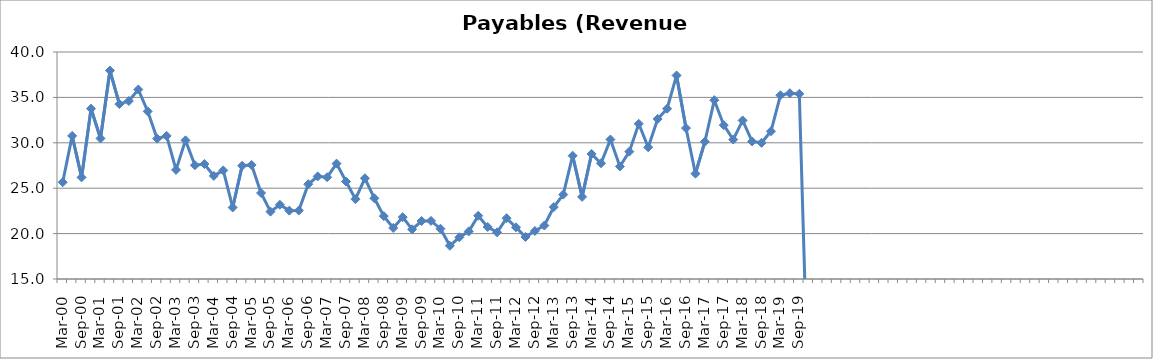
| Category | Payables (Revenue Days) |
|---|---|
| Mar-00 | 25.656 |
| Jun-00 | 30.761 |
| Sep-00 | 26.193 |
| Dec-00 | 33.759 |
| Mar-01 | 30.477 |
| Jun-01 | 37.958 |
| Sep-01 | 34.261 |
| Dec-01 | 34.604 |
| Mar-02 | 35.871 |
| Jun-02 | 33.462 |
| Sep-02 | 30.46 |
| Dec-02 | 30.76 |
| Mar-03 | 27.023 |
| Jun-03 | 30.27 |
| Sep-03 | 27.531 |
| Dec-03 | 27.665 |
| Mar-04 | 26.355 |
| Jun-04 | 26.959 |
| Sep-04 | 22.877 |
| Dec-04 | 27.474 |
| Mar-05 | 27.565 |
| Jun-05 | 24.474 |
| Sep-05 | 22.422 |
| Dec-05 | 23.176 |
| Mar-06 | 22.53 |
| Jun-06 | 22.539 |
| Sep-06 | 25.437 |
| Dec-06 | 26.3 |
| Mar-07 | 26.213 |
| Jun-07 | 27.709 |
| Sep-07 | 25.733 |
| Dec-07 | 23.793 |
| Mar-08 | 26.093 |
| Jun-08 | 23.891 |
| Sep-08 | 21.927 |
| Dec-08 | 20.62 |
| Mar-09 | 21.811 |
| Jun-09 | 20.466 |
| Sep-09 | 21.387 |
| Dec-09 | 21.399 |
| Mar-10 | 20.538 |
| Jun-10 | 18.659 |
| Sep-10 | 19.592 |
| Dec-10 | 20.246 |
| Mar-11 | 21.967 |
| Jun-11 | 20.731 |
| Sep-11 | 20.135 |
| Dec-11 | 21.692 |
| Mar-12 | 20.694 |
| Jun-12 | 19.624 |
| Sep-12 | 20.29 |
| Dec-12 | 20.888 |
| Mar-13 | 22.923 |
| Jun-13 | 24.297 |
| Sep-13 | 28.577 |
| Dec-13 | 24.045 |
| Mar-14 | 28.771 |
| Jun-14 | 27.746 |
| Sep-14 | 30.362 |
| Dec-14 | 27.396 |
| Mar-15 | 29.029 |
| Jun-15 | 32.093 |
| Sep-15 | 29.505 |
| Dec-15 | 32.623 |
| Mar-16 | 33.751 |
| Jun-16 | 37.417 |
| Sep-16 | 31.624 |
| Dec-16 | 26.603 |
| Mar-17 | 30.121 |
| Jun-17 | 34.691 |
| Sep-17 | 31.942 |
| Dec-17 | 30.355 |
| Mar-18 | 32.464 |
| Jun-18 | 30.148 |
| Sep-18 | 30 |
| Dec-18 | 31.27 |
| Mar-19 | 35.235 |
| Jun-19 | 35.466 |
| Sep-19 | 35.387 |